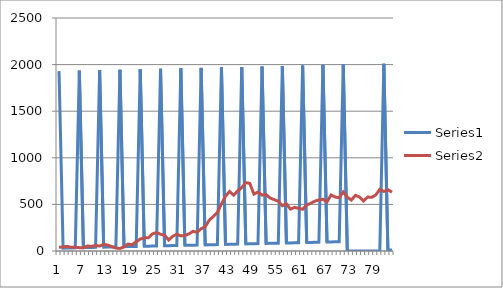
| Category | Series 0 | Series 1 |
|---|---|---|
| 0 | 1930 | 40 |
| 1 | 31 | 44 |
| 2 | 32 | 50 |
| 3 | 33 | 39 |
| 4 | 34 | 40 |
| 5 | 1935 | 36 |
| 6 | 36 | 36 |
| 7 | 37 | 54 |
| 8 | 38 | 49 |
| 9 | 39 | 60 |
| 10 | 1940 | 53 |
| 11 | 41 | 71 |
| 12 | 42 | 64 |
| 13 | 43 | 47 |
| 14 | 44 | 32 |
| 15 | 1945 | 27 |
| 16 | 46 | 44 |
| 17 | 47 | 75 |
| 18 | 48 | 67 |
| 19 | 49 | 99 |
| 20 | 1950 | 128 |
| 21 | 51 | 141 |
| 22 | 52 | 142 |
| 23 | 53 | 183 |
| 24 | 54 | 198 |
| 25 | 1955 | 180 |
| 26 | 56 | 169 |
| 27 | 57 | 118 |
| 28 | 58 | 158 |
| 29 | 59 | 180 |
| 30 | 1960 | 162 |
| 31 | 61 | 167 |
| 32 | 62 | 184 |
| 33 | 63 | 211 |
| 34 | 64 | 201 |
| 35 | 1965 | 239 |
| 36 | 66 | 260 |
| 37 | 67 | 331 |
| 38 | 68 | 370 |
| 39 | 69 | 413 |
| 40 | 1970 | 505 |
| 41 | 71 | 587 |
| 42 | 72 | 639 |
| 43 | 73 | 599 |
| 44 | 74 | 645 |
| 45 | 1975 | 680 |
| 46 | 76 | 734 |
| 47 | 77 | 725 |
| 48 | 78 | 610 |
| 49 | 79 | 632 |
| 50 | 1980 | 600 |
| 51 | 81 | 605 |
| 52 | 82 | 568 |
| 53 | 83 | 551 |
| 54 | 84 | 534 |
| 55 | 1985 | 486 |
| 56 | 86 | 506 |
| 57 | 87 | 449 |
| 58 | 88 | 468 |
| 59 | 89 | 458 |
| 60 | 1990 | 448 |
| 61 | 91 | 493 |
| 62 | 92 | 512 |
| 63 | 93 | 535 |
| 64 | 94 | 548 |
| 65 | 1995 | 555 |
| 66 | 96 | 527 |
| 67 | 97 | 601 |
| 68 | 98 | 579 |
| 69 | 99 | 572 |
| 70 | 2000 | 633 |
| 71 | 0 | 577 |
| 72 | 0 | 547 |
| 73 | 0 | 597 |
| 74 | 0 | 580 |
| 75 | 0 | 536 |
| 76 | 0 | 579 |
| 77 | 0 | 576 |
| 78 | 0 | 601 |
| 79 | 0 | 662 |
| 80 | 2010 | 639 |
| 81 | 11 | 657 |
| 82 | 12 | 631 |